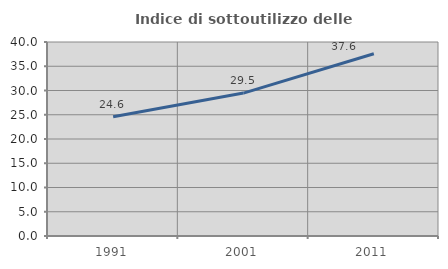
| Category | Indice di sottoutilizzo delle abitazioni  |
|---|---|
| 1991.0 | 24.567 |
| 2001.0 | 29.467 |
| 2011.0 | 37.572 |